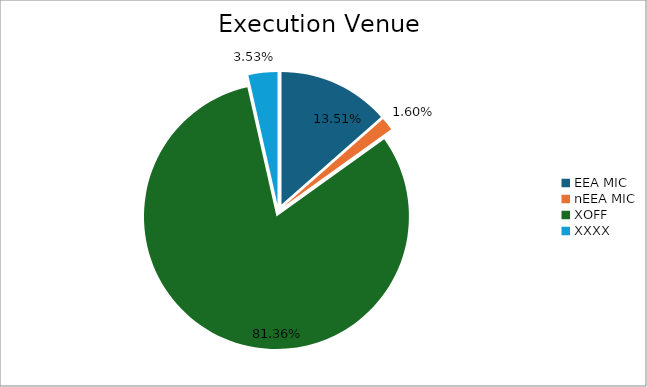
| Category | Series 0 |
|---|---|
| EEA MIC | 5800.01 |
| nEEA MIC | 685.698 |
| XOFF | 34925.596 |
| XXXX | 1515.602 |